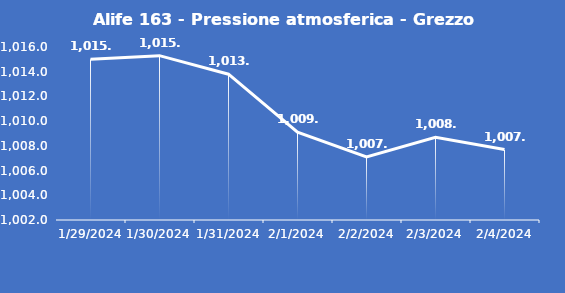
| Category | Alife 163 - Pressione atmosferica - Grezzo (hPa) |
|---|---|
| 1/29/24 | 1015 |
| 1/30/24 | 1015.3 |
| 1/31/24 | 1013.8 |
| 2/1/24 | 1009.1 |
| 2/2/24 | 1007.1 |
| 2/3/24 | 1008.7 |
| 2/4/24 | 1007.7 |